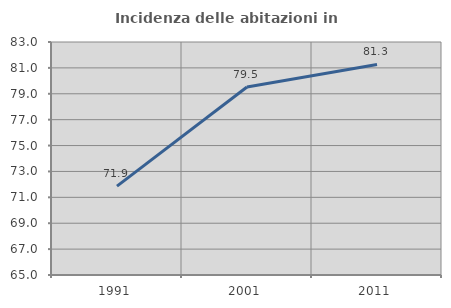
| Category | Incidenza delle abitazioni in proprietà  |
|---|---|
| 1991.0 | 71.868 |
| 2001.0 | 79.519 |
| 2011.0 | 81.264 |